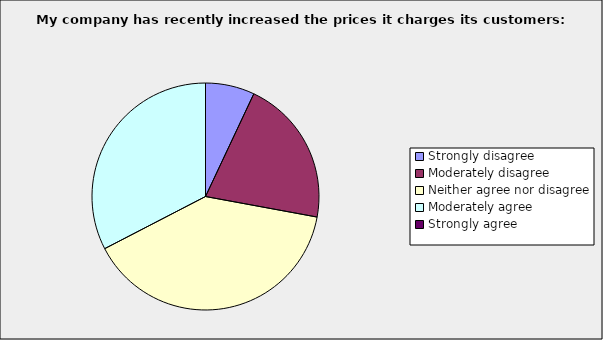
| Category | Series 0 |
|---|---|
| Strongly disagree | 0.07 |
| Moderately disagree | 0.209 |
| Neither agree nor disagree | 0.395 |
| Moderately agree | 0.326 |
| Strongly agree | 0 |